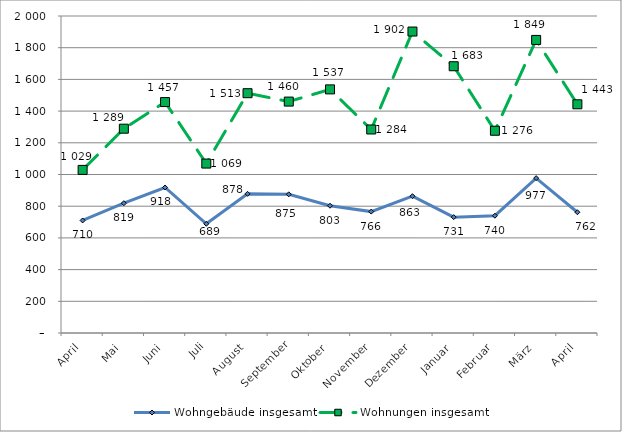
| Category | Wohngebäude insgesamt | Wohnungen insgesamt |
|---|---|---|
| April | 710 | 1029 |
| Mai | 819 | 1289 |
| Juni | 918 | 1457 |
| Juli | 689 | 1069 |
| August | 878 | 1513 |
| September | 875 | 1460 |
| Oktober | 803 | 1537 |
| November | 766 | 1284 |
| Dezember | 863 | 1902 |
| Januar | 731 | 1683 |
| Februar | 740 | 1276 |
| März | 977 | 1849 |
| April | 762 | 1443 |